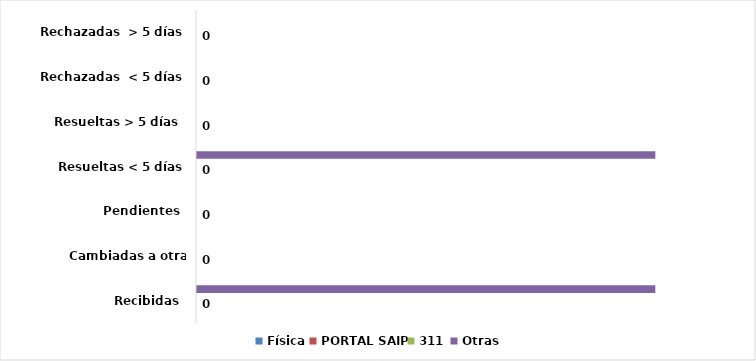
| Category | Física | PORTAL SAIP | 311 | Otras |
|---|---|---|---|---|
| Recibidas  | 0 | 0 | 0 | 1 |
| Cambiadas a otra institución | 0 | 0 | 0 | 0 |
| Pendientes  | 0 | 0 | 0 | 0 |
| Resueltas < 5 días | 0 | 0 | 0 | 1 |
| Resueltas > 5 días  | 0 | 0 | 0 | 0 |
| Rechazadas  < 5 días | 0 | 0 | 0 | 0 |
| Rechazadas  > 5 días | 0 | 0 | 0 | 0 |